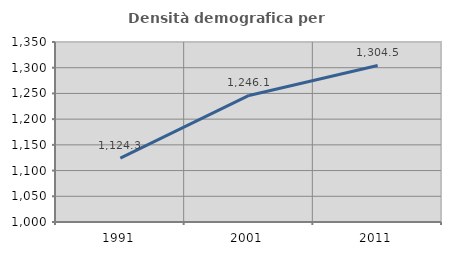
| Category | Densità demografica |
|---|---|
| 1991.0 | 1124.299 |
| 2001.0 | 1246.124 |
| 2011.0 | 1304.452 |